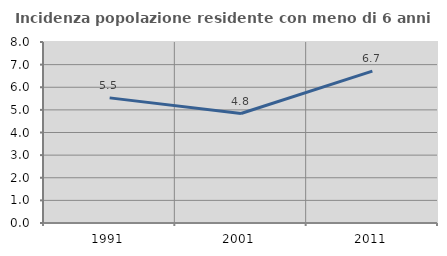
| Category | Incidenza popolazione residente con meno di 6 anni |
|---|---|
| 1991.0 | 5.531 |
| 2001.0 | 4.839 |
| 2011.0 | 6.713 |